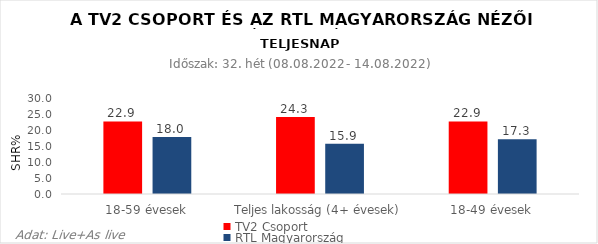
| Category | TV2 Csoport | RTL Magyarország |
|---|---|---|
| 18-59 évesek | 22.9 | 18 |
| Teljes lakosság (4+ évesek) | 24.3 | 15.9 |
| 18-49 évesek | 22.9 | 17.3 |